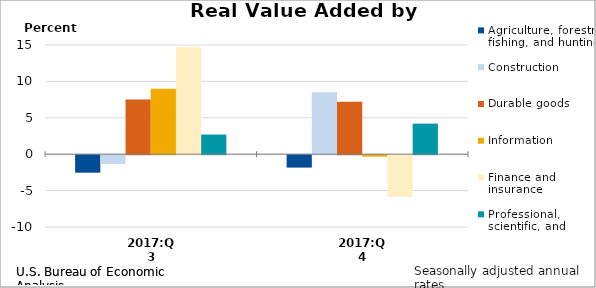
| Category | Agriculture, forestry, fishing, and hunting | Construction | Durable goods | Information | Finance and insurance | Professional, scientific, and technical services |
|---|---|---|---|---|---|---|
| 2017:Q3 | -2.4 | -1.2 | 7.5 | 9 | 14.7 | 2.7 |
| 2017:Q4 | -1.7 | 8.5 | 7.2 | -0.2 | -5.7 | 4.2 |